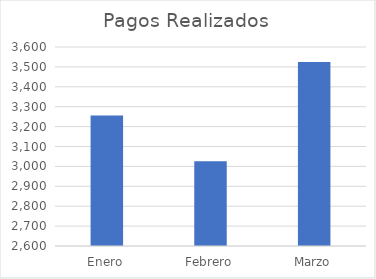
| Category | Pagos Realizados |
|---|---|
| Enero | 3256 |
| Febrero | 3026 |
| Marzo | 3525 |